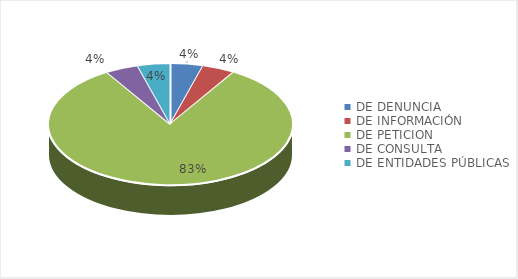
| Category | Series 0 |
|---|---|
| DE DENUNCIA | 1 |
| DE INFORMACIÓN | 1 |
| DE PETICION | 19 |
| DE CONSULTA | 1 |
| DE ENTIDADES PÚBLICAS | 1 |